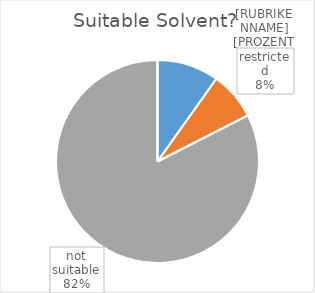
| Category | Series 0 |
|---|---|
| 0 | 18 |
| 1 | 14 |
| 2 | 151 |
| 3 | 0 |